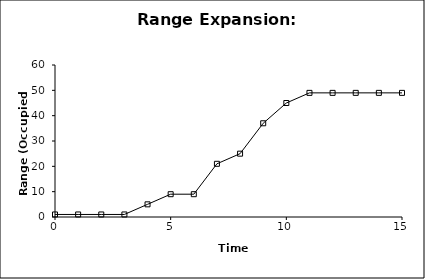
| Category | Range |
|---|---|
| 0.0 | 1 |
| 1.0 | 1 |
| 2.0 | 1 |
| 3.0 | 1 |
| 4.0 | 5 |
| 5.0 | 9 |
| 6.0 | 9 |
| 7.0 | 21 |
| 8.0 | 25 |
| 9.0 | 37 |
| 10.0 | 45 |
| 11.0 | 49 |
| 12.0 | 49 |
| 13.0 | 49 |
| 14.0 | 49 |
| 15.0 | 49 |